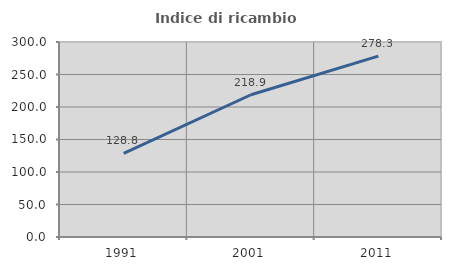
| Category | Indice di ricambio occupazionale  |
|---|---|
| 1991.0 | 128.796 |
| 2001.0 | 218.852 |
| 2011.0 | 278.313 |